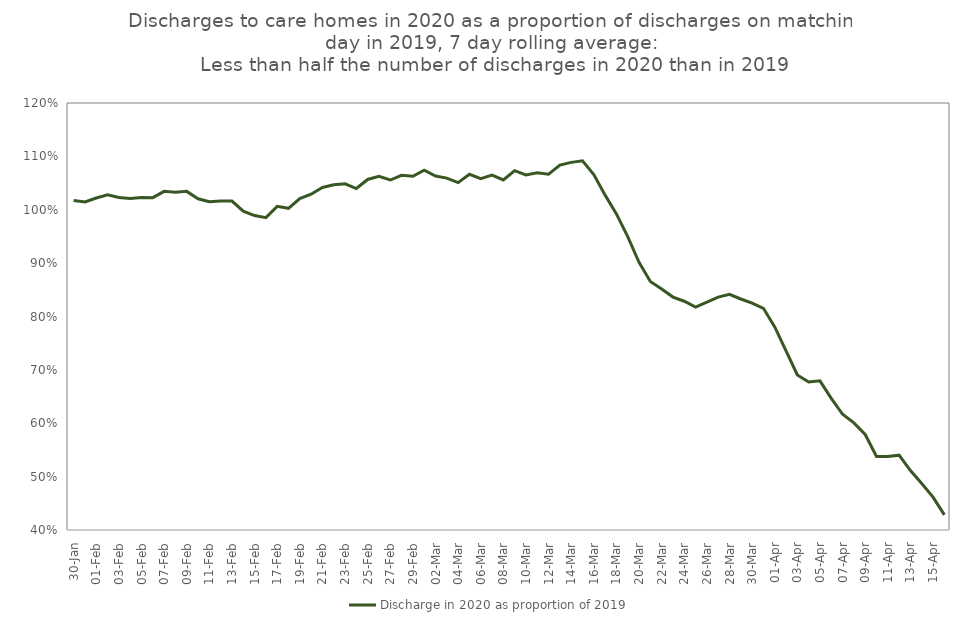
| Category | Discharge in 2020 as proportion of 2019 |
|---|---|
| 30-Jan | 1.018 |
| 31-Jan | 1.015 |
| 01-Feb | 1.022 |
| 02-Feb | 1.028 |
| 03-Feb | 1.023 |
| 04-Feb | 1.021 |
| 05-Feb | 1.023 |
| 06-Feb | 1.023 |
| 07-Feb | 1.034 |
| 08-Feb | 1.033 |
| 09-Feb | 1.034 |
| 10-Feb | 1.02 |
| 11-Feb | 1.015 |
| 12-Feb | 1.016 |
| 13-Feb | 1.016 |
| 14-Feb | 0.997 |
| 15-Feb | 0.989 |
| 16-Feb | 0.985 |
| 17-Feb | 1.006 |
| 18-Feb | 1.003 |
| 19-Feb | 1.021 |
| 20-Feb | 1.029 |
| 21-Feb | 1.042 |
| 22-Feb | 1.047 |
| 23-Feb | 1.049 |
| 24-Feb | 1.04 |
| 25-Feb | 1.057 |
| 26-Feb | 1.062 |
| 27-Feb | 1.056 |
| 28-Feb | 1.064 |
| 29-Feb | 1.063 |
| 01-Mar | 1.074 |
| 02-Mar | 1.063 |
| 03-Mar | 1.059 |
| 04-Mar | 1.051 |
| 05-Mar | 1.066 |
| 06-Mar | 1.058 |
| 07-Mar | 1.065 |
| 08-Mar | 1.056 |
| 09-Mar | 1.073 |
| 10-Mar | 1.065 |
| 11-Mar | 1.069 |
| 12-Mar | 1.067 |
| 13-Mar | 1.084 |
| 14-Mar | 1.089 |
| 15-Mar | 1.092 |
| 16-Mar | 1.066 |
| 17-Mar | 1.027 |
| 18-Mar | 0.992 |
| 19-Mar | 0.95 |
| 20-Mar | 0.902 |
| 21-Mar | 0.865 |
| 22-Mar | 0.852 |
| 23-Mar | 0.836 |
| 24-Mar | 0.829 |
| 25-Mar | 0.818 |
| 26-Mar | 0.827 |
| 27-Mar | 0.836 |
| 28-Mar | 0.841 |
| 29-Mar | 0.833 |
| 30-Mar | 0.825 |
| 31-Mar | 0.815 |
| 01-Apr | 0.78 |
| 02-Apr | 0.736 |
| 03-Apr | 0.69 |
| 04-Apr | 0.677 |
| 05-Apr | 0.68 |
| 06-Apr | 0.647 |
| 07-Apr | 0.617 |
| 08-Apr | 0.601 |
| 09-Apr | 0.579 |
| 10-Apr | 0.538 |
| 11-Apr | 0.538 |
| 12-Apr | 0.54 |
| 13-Apr | 0.511 |
| 14-Apr | 0.487 |
| 15-Apr | 0.462 |
| 16-Apr | 0.428 |